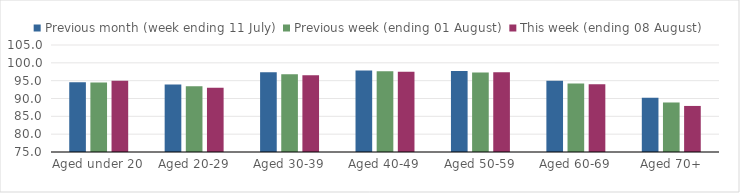
| Category | Previous month (week ending 11 July) | Previous week (ending 01 August) | This week (ending 08 August) |
|---|---|---|---|
| Aged under 20 | 94.542 | 94.483 | 94.965 |
| Aged 20-29 | 93.89 | 93.411 | 93.039 |
| Aged 30-39 | 97.346 | 96.774 | 96.489 |
| Aged 40-49 | 97.874 | 97.607 | 97.527 |
| Aged 50-59 | 97.694 | 97.298 | 97.333 |
| Aged 60-69 | 94.988 | 94.233 | 94.004 |
| Aged 70+ | 90.212 | 88.884 | 87.913 |